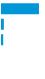
| Category | Series 0 |
|---|---|
| 0 | 0.924 |
| 1 | 0.046 |
| 2 | 0.03 |
| 3 | 0 |